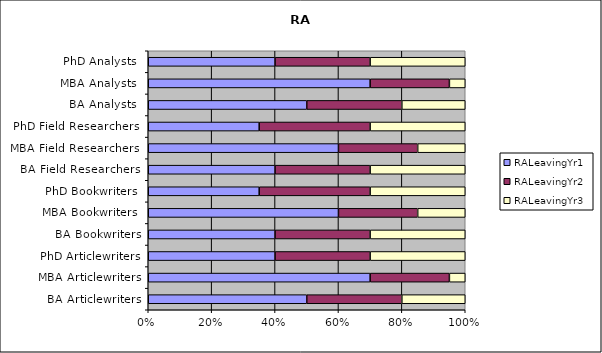
| Category | RALeavingYr1 | RALeavingYr2 | RALeavingYr3 |
|---|---|---|---|
| BA Articlewriters | 0.5 | 0.3 | 0.2 |
| MBA Articlewriters | 0.7 | 0.25 | 0.05 |
| PhD Articlewriters | 0.4 | 0.3 | 0.3 |
| BA Bookwriters | 0.4 | 0.3 | 0.3 |
| MBA Bookwriters  | 0.6 | 0.25 | 0.15 |
| PhD Bookwriters  | 0.35 | 0.35 | 0.3 |
| BA Field Researchers  | 0.4 | 0.3 | 0.3 |
| MBA Field Researchers  | 0.6 | 0.25 | 0.15 |
| PhD Field Researchers  | 0.35 | 0.35 | 0.3 |
| BA Analysts  | 0.5 | 0.3 | 0.2 |
| MBA Analysts  | 0.7 | 0.25 | 0.05 |
| PhD Analysts  | 0.4 | 0.3 | 0.3 |